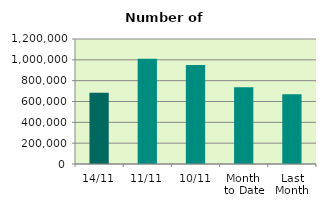
| Category | Series 0 |
|---|---|
| 14/11 | 682994 |
| 11/11 | 1010896 |
| 10/11 | 950702 |
| Month 
to Date | 736728.4 |
| Last
Month | 669366.857 |